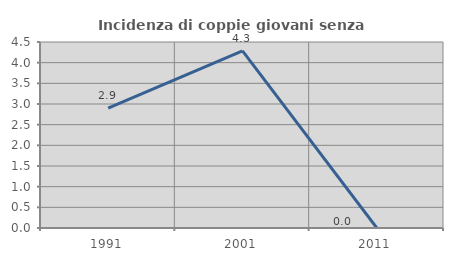
| Category | Incidenza di coppie giovani senza figli |
|---|---|
| 1991.0 | 2.899 |
| 2001.0 | 4.286 |
| 2011.0 | 0 |